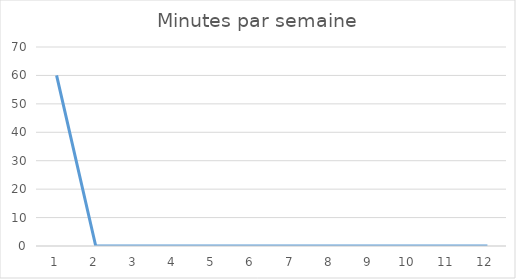
| Category | Minutes par semaine |
|---|---|
| 0 | 60 |
| 1 | 0 |
| 2 | 0 |
| 3 | 0 |
| 4 | 0 |
| 5 | 0 |
| 6 | 0 |
| 7 | 0 |
| 8 | 0 |
| 9 | 0 |
| 10 | 0 |
| 11 | 0 |